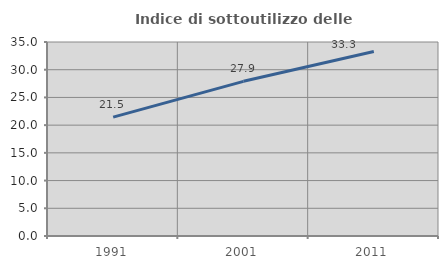
| Category | Indice di sottoutilizzo delle abitazioni  |
|---|---|
| 1991.0 | 21.453 |
| 2001.0 | 27.906 |
| 2011.0 | 33.287 |